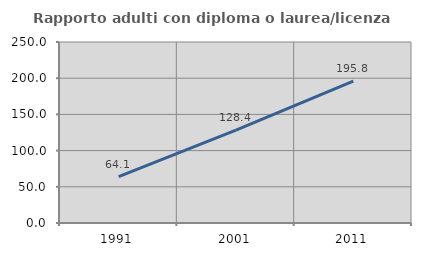
| Category | Rapporto adulti con diploma o laurea/licenza media  |
|---|---|
| 1991.0 | 64.103 |
| 2001.0 | 128.378 |
| 2011.0 | 195.833 |